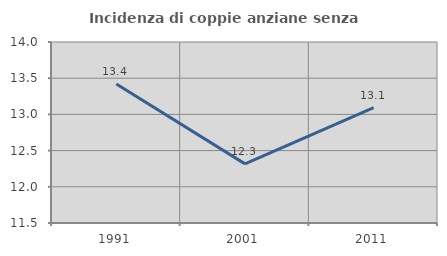
| Category | Incidenza di coppie anziane senza figli  |
|---|---|
| 1991.0 | 13.419 |
| 2001.0 | 12.317 |
| 2011.0 | 13.095 |